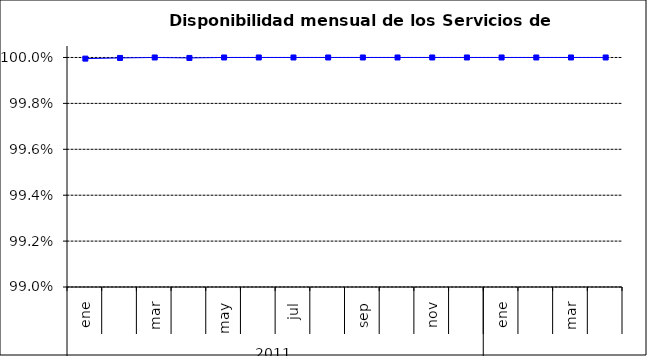
| Category | SCL * |
|---|---|
| 0 | 1 |
| 1 | 1 |
| 2 | 1 |
| 3 | 1 |
| 4 | 1 |
| 5 | 1 |
| 6 | 1 |
| 7 | 1 |
| 8 | 1 |
| 9 | 1 |
| 10 | 1 |
| 11 | 1 |
| 12 | 1 |
| 13 | 1 |
| 14 | 1 |
| 15 | 1 |